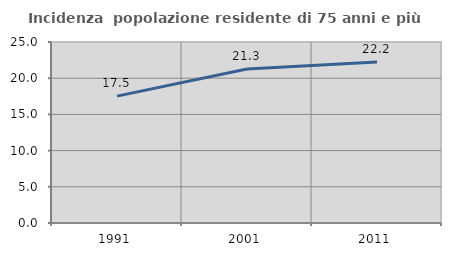
| Category | Incidenza  popolazione residente di 75 anni e più |
|---|---|
| 1991.0 | 17.526 |
| 2001.0 | 21.261 |
| 2011.0 | 22.222 |